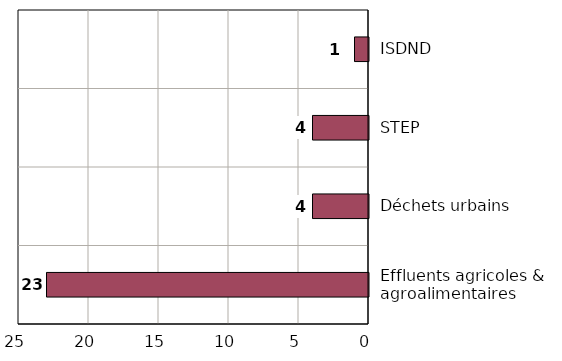
| Category | Nombre de projets raccordés au réseau |
|---|---|
| Effluents agricoles & agroalimentaires | 23 |
| Déchets urbains | 4 |
| STEP | 4 |
| ISDND | 1 |